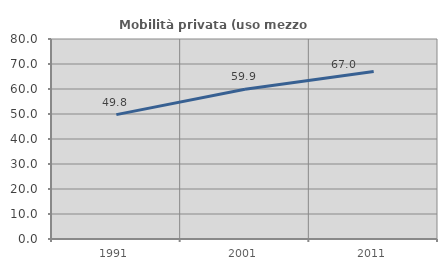
| Category | Mobilità privata (uso mezzo privato) |
|---|---|
| 1991.0 | 49.75 |
| 2001.0 | 59.897 |
| 2011.0 | 66.971 |